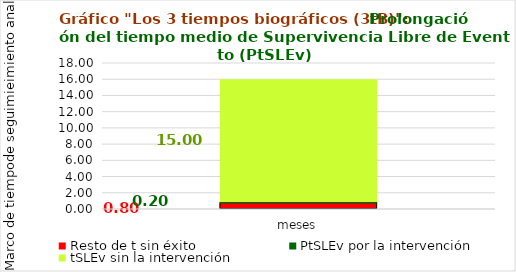
| Category | Resto de t sin éxito | PtSLEv por la intervención | tSLEv sin la intervención |
|---|---|---|---|
| meses | 0.801 | 0.197 | 15.002 |